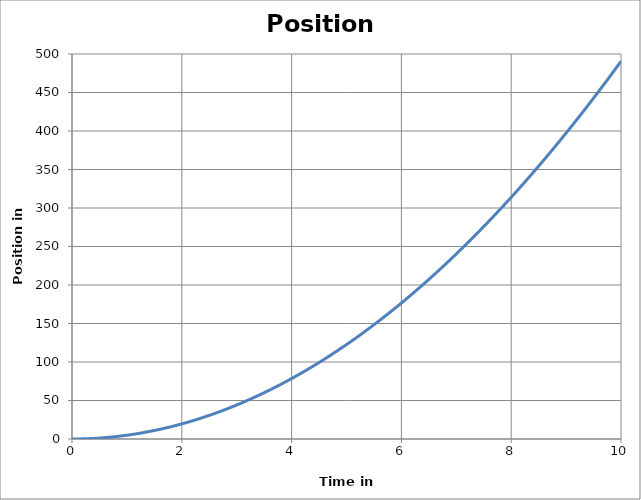
| Category | Position (m) |
|---|---|
| 0.0 | 0 |
| 0.1 | 0.049 |
| 0.2 | 0.196 |
| 0.30000000000000004 | 0.441 |
| 0.4 | 0.785 |
| 0.5 | 1.226 |
| 0.6 | 1.766 |
| 0.7 | 2.403 |
| 0.7999999999999999 | 3.139 |
| 0.8999999999999999 | 3.973 |
| 0.9999999999999999 | 4.905 |
| 1.0999999999999999 | 5.935 |
| 1.2 | 7.063 |
| 1.3 | 8.289 |
| 1.4000000000000001 | 9.614 |
| 1.5000000000000002 | 11.036 |
| 1.6000000000000003 | 12.557 |
| 1.7000000000000004 | 14.175 |
| 1.8000000000000005 | 15.892 |
| 1.9000000000000006 | 17.707 |
| 2.0000000000000004 | 19.62 |
| 2.1000000000000005 | 21.631 |
| 2.2000000000000006 | 23.74 |
| 2.3000000000000007 | 25.947 |
| 2.400000000000001 | 28.253 |
| 2.500000000000001 | 30.656 |
| 2.600000000000001 | 33.158 |
| 2.700000000000001 | 35.757 |
| 2.800000000000001 | 38.455 |
| 2.9000000000000012 | 41.251 |
| 3.0000000000000013 | 44.145 |
| 3.1000000000000014 | 47.137 |
| 3.2000000000000015 | 50.227 |
| 3.3000000000000016 | 53.415 |
| 3.4000000000000017 | 56.702 |
| 3.5000000000000018 | 60.086 |
| 3.600000000000002 | 63.569 |
| 3.700000000000002 | 67.149 |
| 3.800000000000002 | 70.828 |
| 3.900000000000002 | 74.605 |
| 4.000000000000002 | 78.48 |
| 4.100000000000001 | 82.453 |
| 4.200000000000001 | 86.524 |
| 4.300000000000001 | 90.693 |
| 4.4 | 94.961 |
| 4.5 | 99.326 |
| 4.6 | 103.79 |
| 4.699999999999999 | 108.351 |
| 4.799999999999999 | 113.011 |
| 4.899999999999999 | 117.769 |
| 4.999999999999998 | 122.625 |
| 5.099999999999998 | 127.579 |
| 5.1999999999999975 | 132.631 |
| 5.299999999999997 | 137.781 |
| 5.399999999999997 | 143.03 |
| 5.4999999999999964 | 148.376 |
| 5.599999999999996 | 153.821 |
| 5.699999999999996 | 159.363 |
| 5.799999999999995 | 165.004 |
| 5.899999999999995 | 170.743 |
| 5.999999999999995 | 176.58 |
| 6.099999999999994 | 182.515 |
| 6.199999999999994 | 188.548 |
| 6.299999999999994 | 194.679 |
| 6.399999999999993 | 200.909 |
| 6.499999999999993 | 207.236 |
| 6.5999999999999925 | 213.662 |
| 6.699999999999992 | 220.185 |
| 6.799999999999992 | 226.807 |
| 6.8999999999999915 | 233.527 |
| 6.999999999999991 | 240.345 |
| 7.099999999999991 | 247.261 |
| 7.19999999999999 | 254.275 |
| 7.29999999999999 | 261.387 |
| 7.39999999999999 | 268.598 |
| 7.499999999999989 | 275.906 |
| 7.599999999999989 | 283.313 |
| 7.699999999999989 | 290.817 |
| 7.799999999999988 | 298.42 |
| 7.899999999999988 | 306.121 |
| 7.999999999999988 | 313.92 |
| 8.099999999999987 | 321.817 |
| 8.199999999999987 | 329.812 |
| 8.299999999999986 | 337.905 |
| 8.399999999999986 | 346.097 |
| 8.499999999999986 | 354.386 |
| 8.599999999999985 | 362.774 |
| 8.699999999999985 | 371.259 |
| 8.799999999999985 | 379.843 |
| 8.899999999999984 | 388.525 |
| 8.999999999999984 | 397.305 |
| 9.099999999999984 | 406.183 |
| 9.199999999999983 | 415.159 |
| 9.299999999999983 | 424.233 |
| 9.399999999999983 | 433.406 |
| 9.499999999999982 | 442.676 |
| 9.599999999999982 | 452.045 |
| 9.699999999999982 | 461.511 |
| 9.799999999999981 | 471.076 |
| 9.89999999999998 | 480.739 |
| 9.99999999999998 | 490.5 |